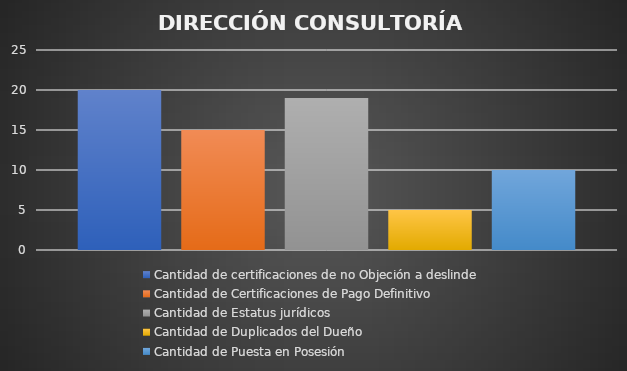
| Category | Cantidad de certificaciones de no Objeción a deslinde | Cantidad de Certificaciones de Pago Definitivo  | Cantidad de Estatus jurídicos | Cantidad de Duplicados del Dueño | Cantidad de Puesta en Posesión  |
|---|---|---|---|---|---|
| 0 | 20 | 15 | 19 | 5 | 10 |